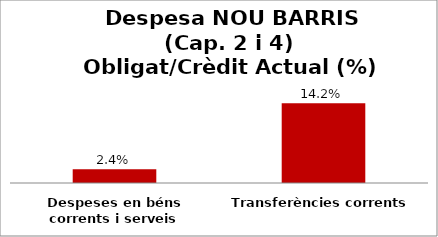
| Category | Series 0 |
|---|---|
| Despeses en béns corrents i serveis | 0.024 |
| Transferències corrents | 0.142 |